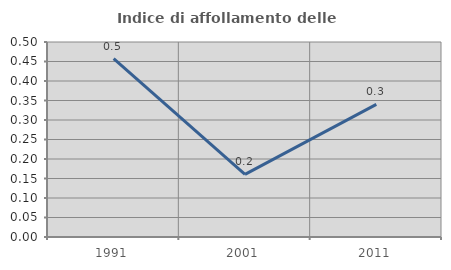
| Category | Indice di affollamento delle abitazioni  |
|---|---|
| 1991.0 | 0.457 |
| 2001.0 | 0.161 |
| 2011.0 | 0.34 |